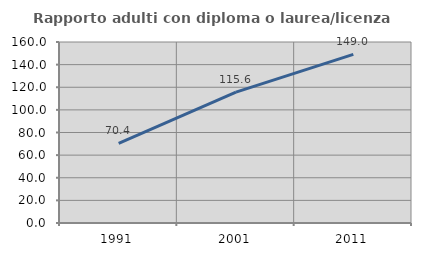
| Category | Rapporto adulti con diploma o laurea/licenza media  |
|---|---|
| 1991.0 | 70.449 |
| 2001.0 | 115.634 |
| 2011.0 | 149.012 |